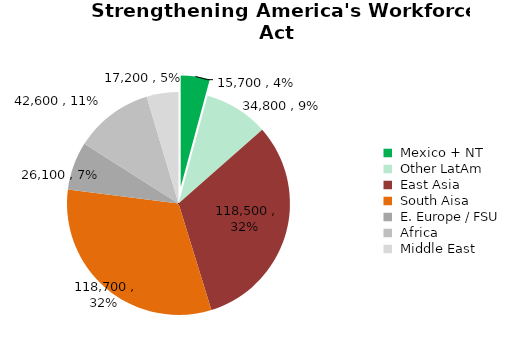
| Category | H1 Class Visas Issued |
|---|---|
|  Mexico + NT  | 15700 |
|  Other LatAm  | 34800 |
|  East Asia  | 118500 |
|  South Aisa  | 118700 |
|  E. Europe / FSU  | 26100 |
|  Africa  | 42600 |
|  Middle East  | 17200 |